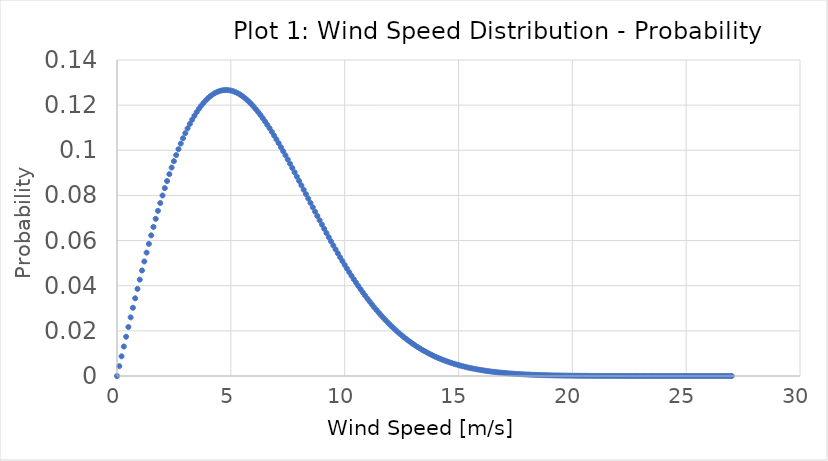
| Category | Series 0 |
|---|---|
| 0.0 | 0 |
| 0.1 | 0.004 |
| 0.2 | 0.009 |
| 0.3 | 0.013 |
| 0.4 | 0.017 |
| 0.5 | 0.022 |
| 0.6 | 0.026 |
| 0.7 | 0.03 |
| 0.8 | 0.034 |
| 0.9 | 0.039 |
| 1.0 | 0.043 |
| 1.1 | 0.047 |
| 1.2 | 0.051 |
| 1.3 | 0.055 |
| 1.4 | 0.059 |
| 1.5 | 0.062 |
| 1.6 | 0.066 |
| 1.7 | 0.07 |
| 1.8 | 0.073 |
| 1.9 | 0.077 |
| 2.0 | 0.08 |
| 2.1 | 0.083 |
| 2.2 | 0.086 |
| 2.3 | 0.089 |
| 2.4 | 0.092 |
| 2.5 | 0.095 |
| 2.6 | 0.098 |
| 2.7 | 0.1 |
| 2.8 | 0.103 |
| 2.9 | 0.105 |
| 3.0 | 0.108 |
| 3.1 | 0.11 |
| 3.2 | 0.112 |
| 3.3 | 0.114 |
| 3.4 | 0.115 |
| 3.5 | 0.117 |
| 3.6 | 0.118 |
| 3.7 | 0.12 |
| 3.8 | 0.121 |
| 3.9 | 0.122 |
| 4.0 | 0.123 |
| 4.1 | 0.124 |
| 4.2 | 0.125 |
| 4.3 | 0.125 |
| 4.4 | 0.126 |
| 4.5 | 0.126 |
| 4.6 | 0.126 |
| 4.7 | 0.127 |
| 4.8 | 0.127 |
| 4.9 | 0.127 |
| 5.0 | 0.126 |
| 5.1 | 0.126 |
| 5.2 | 0.126 |
| 5.3 | 0.125 |
| 5.4 | 0.125 |
| 5.5 | 0.124 |
| 5.6 | 0.123 |
| 5.7 | 0.122 |
| 5.8 | 0.121 |
| 5.9 | 0.12 |
| 6.0 | 0.119 |
| 6.1 | 0.118 |
| 6.2 | 0.117 |
| 6.3 | 0.116 |
| 6.4 | 0.114 |
| 6.5 | 0.113 |
| 6.6 | 0.111 |
| 6.7 | 0.11 |
| 6.8 | 0.108 |
| 6.9 | 0.107 |
| 7.0 | 0.105 |
| 7.1 | 0.103 |
| 7.2 | 0.101 |
| 7.3 | 0.1 |
| 7.4 | 0.098 |
| 7.5 | 0.096 |
| 7.6 | 0.094 |
| 7.7 | 0.092 |
| 7.8 | 0.09 |
| 7.9 | 0.088 |
| 8.0 | 0.086 |
| 8.1 | 0.084 |
| 8.2 | 0.083 |
| 8.3 | 0.081 |
| 8.4 | 0.079 |
| 8.5 | 0.077 |
| 8.6 | 0.075 |
| 8.7 | 0.073 |
| 8.8 | 0.071 |
| 8.9 | 0.069 |
| 9.0 | 0.067 |
| 9.1 | 0.065 |
| 9.2 | 0.063 |
| 9.3 | 0.061 |
| 9.4 | 0.06 |
| 9.5 | 0.058 |
| 9.6 | 0.056 |
| 9.7 | 0.054 |
| 9.8 | 0.053 |
| 9.9 | 0.051 |
| 10.0 | 0.049 |
| 10.1 | 0.048 |
| 10.2 | 0.046 |
| 10.3 | 0.044 |
| 10.4 | 0.043 |
| 10.5 | 0.041 |
| 10.6 | 0.04 |
| 10.7 | 0.038 |
| 10.8 | 0.037 |
| 10.9 | 0.036 |
| 11.0 | 0.034 |
| 11.1 | 0.033 |
| 11.2 | 0.032 |
| 11.3 | 0.03 |
| 11.4 | 0.029 |
| 11.5 | 0.028 |
| 11.6 | 0.027 |
| 11.7 | 0.026 |
| 11.8 | 0.025 |
| 11.9 | 0.024 |
| 12.0 | 0.023 |
| 12.1 | 0.022 |
| 12.2 | 0.021 |
| 12.3 | 0.02 |
| 12.4 | 0.019 |
| 12.5 | 0.018 |
| 12.6 | 0.017 |
| 12.7 | 0.016 |
| 12.8 | 0.016 |
| 12.9 | 0.015 |
| 13.0 | 0.014 |
| 13.1 | 0.014 |
| 13.2 | 0.013 |
| 13.3 | 0.012 |
| 13.4 | 0.012 |
| 13.5 | 0.011 |
| 13.6 | 0.01 |
| 13.7 | 0.01 |
| 13.8 | 0.009 |
| 13.9 | 0.009 |
| 14.0 | 0.008 |
| 14.1 | 0.008 |
| 14.2 | 0.008 |
| 14.3 | 0.007 |
| 14.4 | 0.007 |
| 14.5 | 0.006 |
| 14.6 | 0.006 |
| 14.7 | 0.006 |
| 14.8 | 0.005 |
| 14.9 | 0.005 |
| 15.0 | 0.005 |
| 15.1 | 0.005 |
| 15.2 | 0.004 |
| 15.3 | 0.004 |
| 15.4 | 0.004 |
| 15.5 | 0.004 |
| 15.6 | 0.003 |
| 15.7 | 0.003 |
| 15.8 | 0.003 |
| 15.9 | 0.003 |
| 16.0 | 0.003 |
| 16.1 | 0.002 |
| 16.2 | 0.002 |
| 16.3 | 0.002 |
| 16.4 | 0.002 |
| 16.5 | 0.002 |
| 16.6 | 0.002 |
| 16.7 | 0.002 |
| 16.8 | 0.002 |
| 16.9 | 0.001 |
| 17.0 | 0.001 |
| 17.1 | 0.001 |
| 17.2 | 0.001 |
| 17.3 | 0.001 |
| 17.4 | 0.001 |
| 17.5 | 0.001 |
| 17.6 | 0.001 |
| 17.7 | 0.001 |
| 17.8 | 0.001 |
| 17.9 | 0.001 |
| 18.0 | 0.001 |
| 18.1 | 0.001 |
| 18.2 | 0.001 |
| 18.3 | 0.001 |
| 18.4 | 0 |
| 18.5 | 0 |
| 18.6 | 0 |
| 18.7 | 0 |
| 18.8 | 0 |
| 18.9 | 0 |
| 19.0 | 0 |
| 19.1 | 0 |
| 19.2 | 0 |
| 19.3 | 0 |
| 19.4 | 0 |
| 19.5 | 0 |
| 19.6 | 0 |
| 19.7 | 0 |
| 19.8 | 0 |
| 19.9 | 0 |
| 20.0 | 0 |
| 20.1 | 0 |
| 20.2 | 0 |
| 20.3 | 0 |
| 20.4 | 0 |
| 20.5 | 0 |
| 20.6 | 0 |
| 20.7 | 0 |
| 20.8 | 0 |
| 20.9 | 0 |
| 21.0 | 0 |
| 21.1 | 0 |
| 21.2 | 0 |
| 21.3 | 0 |
| 21.4 | 0 |
| 21.5 | 0 |
| 21.6 | 0 |
| 21.7 | 0 |
| 21.8 | 0 |
| 21.9 | 0 |
| 22.0 | 0 |
| 22.1 | 0 |
| 22.2 | 0 |
| 22.3 | 0 |
| 22.4 | 0 |
| 22.5 | 0 |
| 22.6 | 0 |
| 22.7 | 0 |
| 22.8 | 0 |
| 22.9 | 0 |
| 23.0 | 0 |
| 23.1 | 0 |
| 23.2 | 0 |
| 23.3 | 0 |
| 23.4 | 0 |
| 23.5 | 0 |
| 23.6 | 0 |
| 23.7 | 0 |
| 23.8 | 0 |
| 23.9 | 0 |
| 24.0 | 0 |
| 24.1 | 0 |
| 24.2 | 0 |
| 24.3 | 0 |
| 24.4 | 0 |
| 24.5 | 0 |
| 24.6 | 0 |
| 24.7 | 0 |
| 24.8 | 0 |
| 24.9 | 0 |
| 25.0 | 0 |
| 25.1 | 0 |
| 25.2 | 0 |
| 25.3 | 0 |
| 25.4 | 0 |
| 25.5 | 0 |
| 25.6 | 0 |
| 25.7 | 0 |
| 25.8 | 0 |
| 25.9 | 0 |
| 26.0 | 0 |
| 26.1 | 0 |
| 26.2 | 0 |
| 26.3 | 0 |
| 26.4 | 0 |
| 26.5 | 0 |
| 26.6 | 0 |
| 26.7 | 0 |
| 26.8 | 0 |
| 26.9 | 0 |
| 27.0 | 0 |